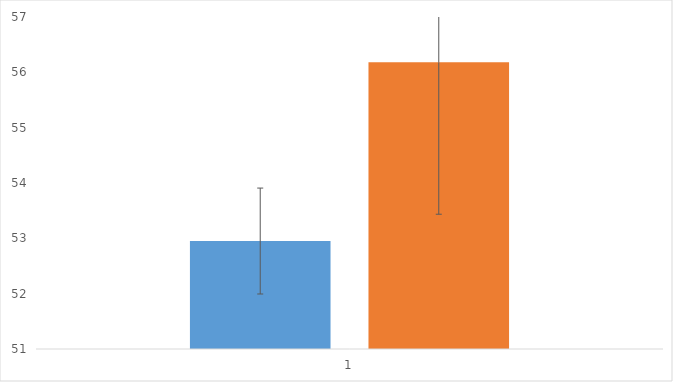
| Category | Al | CNT |
|---|---|---|
| 0 | 52.951 | 56.18 |